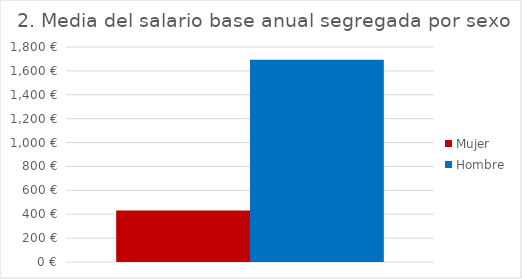
| Category | Mujer | Hombre |
|---|---|---|
| Total | 432.143 | 1692.308 |